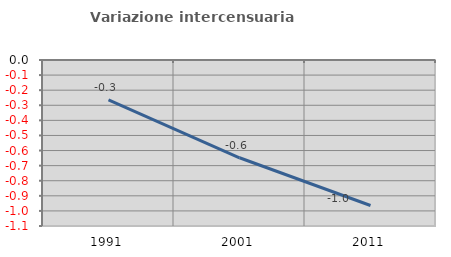
| Category | Variazione intercensuaria annua |
|---|---|
| 1991.0 | -0.264 |
| 2001.0 | -0.648 |
| 2011.0 | -0.964 |